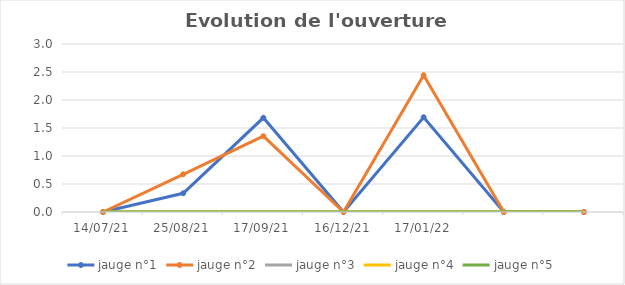
| Category | jauge n°1 | jauge n°2 | jauge n°3 | jauge n°4 | jauge n°5 |
|---|---|---|---|---|---|
| 14/07/21 | 0 | 0 | 0 | 0 | 0 |
| 25/08/21 | 0.334 | 0.674 | 0 | 0 | 0 |
| 17/09/21 | 1.682 | 1.354 | 0 | 0 | 0 |
| 16/12/21 | 0 | 0 | 0 | 0 | 0 |
| 17/01/22 | 1.693 | 2.443 | 0 | 0 | 0 |